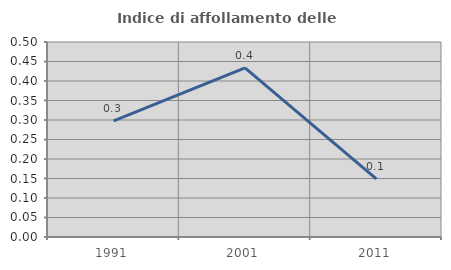
| Category | Indice di affollamento delle abitazioni  |
|---|---|
| 1991.0 | 0.298 |
| 2001.0 | 0.434 |
| 2011.0 | 0.149 |